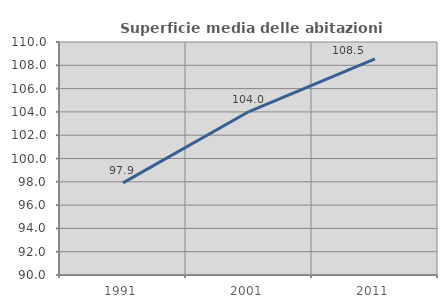
| Category | Superficie media delle abitazioni occupate |
|---|---|
| 1991.0 | 97.908 |
| 2001.0 | 104.03 |
| 2011.0 | 108.547 |